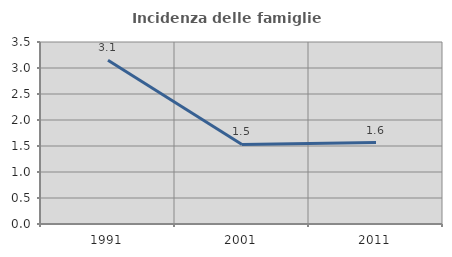
| Category | Incidenza delle famiglie numerose |
|---|---|
| 1991.0 | 3.148 |
| 2001.0 | 1.53 |
| 2011.0 | 1.566 |